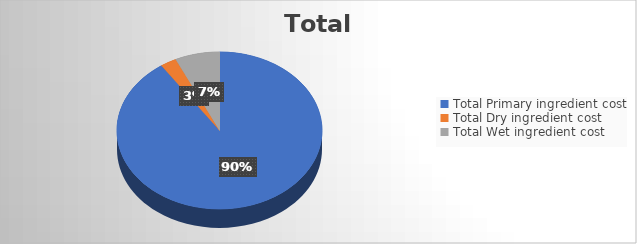
| Category | Series 0 |
|---|---|
| Total Primary ingredient cost | 15.938 |
| Total Dry ingredient cost | 0.45 |
| Total Wet ingredient cost | 1.24 |